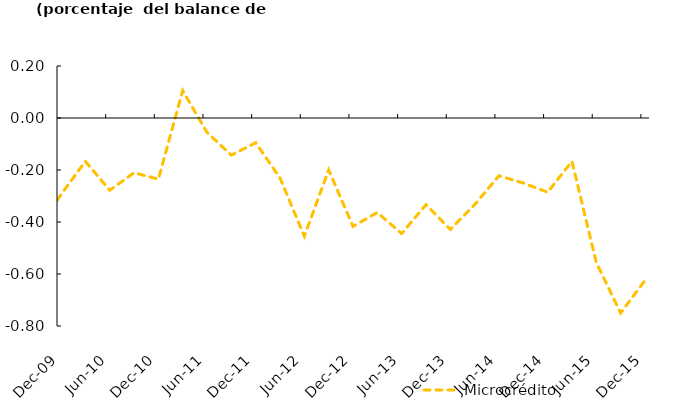
| Category | Microcrédito |
|---|---|
| 2008-03-01 | -0.333 |
| 2008-07-01 | -0.143 |
| 2008-10-01 | -0.357 |
| 2008-12-01 | -0.4 |
| 2009-03-01 | -0.556 |
| 2009-06-01 | -0.368 |
| 2009-09-01 | -0.444 |
| 2009-12-01 | -0.294 |
| 2010-03-01 | -0.167 |
| 2010-06-01 | -0.278 |
| 2010-09-01 | -0.211 |
| 2010-12-01 | -0.235 |
| 2011-03-01 | 0.105 |
| 2011-06-01 | -0.056 |
| 2011-09-01 | -0.143 |
| 2011-12-01 | -0.095 |
| 2012-03-01 | -0.231 |
| 2012-06-01 | -0.455 |
| 2012-09-01 | -0.2 |
| 2012-12-01 | -0.417 |
| 2013-03-01 | -0.364 |
| 2013-06-01 | -0.444 |
| 2013-09-01 | -0.333 |
| 2013-12-01 | -0.429 |
| 2014-03-01 | -0.333 |
| 2014-06-01 | -0.222 |
| 2014-09-01 | -0.25 |
| 2014-12-01 | -0.286 |
| 2015-03-01 | -0.167 |
| 2015-06-01 | -0.556 |
| 2015-09-01 | -0.75 |
| 2015-12-01 | -0.625 |